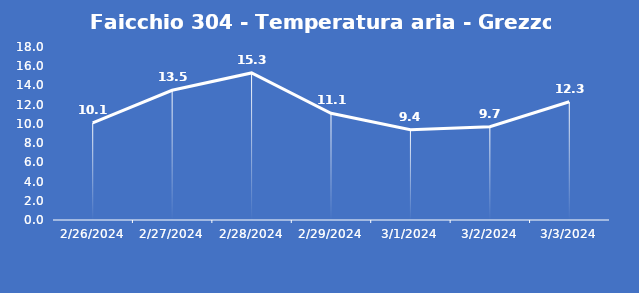
| Category | Faicchio 304 - Temperatura aria - Grezzo (°C) |
|---|---|
| 2/26/24 | 10.1 |
| 2/27/24 | 13.5 |
| 2/28/24 | 15.3 |
| 2/29/24 | 11.1 |
| 3/1/24 | 9.4 |
| 3/2/24 | 9.7 |
| 3/3/24 | 12.3 |